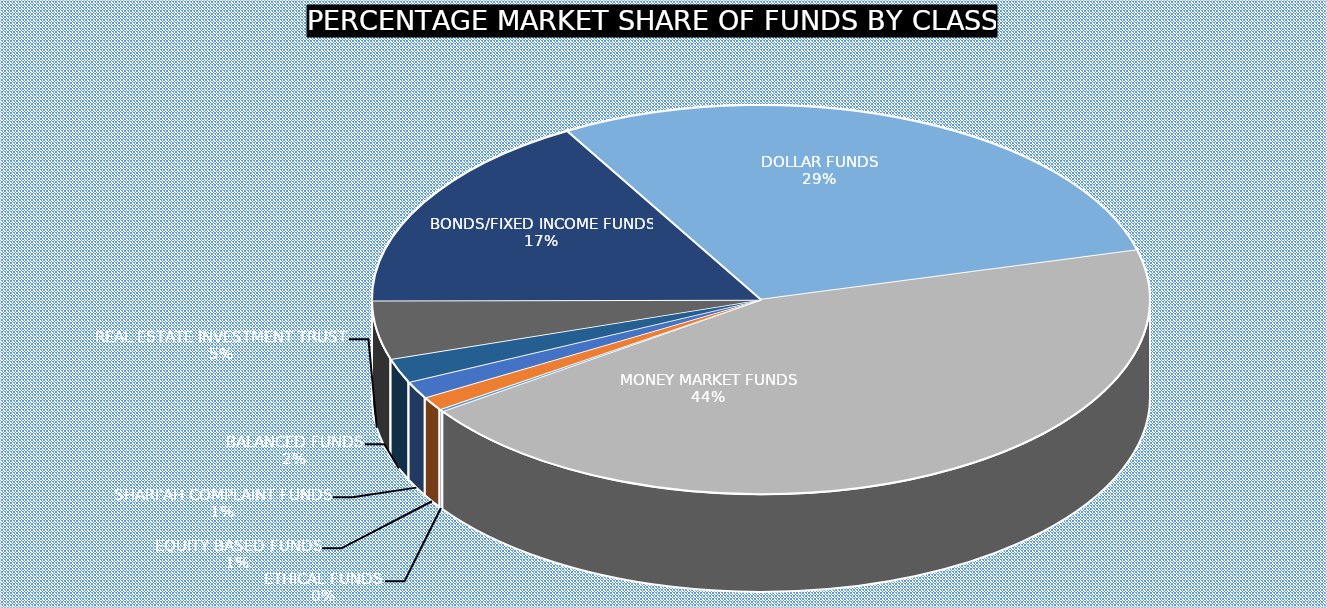
| Category | July 2023 |
|---|---|
| ETHICAL FUNDS | 3748499300.39 |
| EQUITY BASED FUNDS | 21703801741.95 |
| SHARI'AH COMPLAINT FUNDS | 27459487367.48 |
| BALANCED FUNDS | 38647229545.23 |
| REAL ESTATE INVESTMENT TRUST | 93087466919.26 |
| BONDS/FIXED INCOME FUNDS | 320910732787.98 |
| DOLLAR FUNDS | 559469039682.368 |
| MONEY MARKET FUNDS | 849052729545.01 |